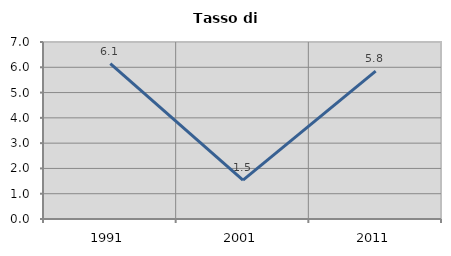
| Category | Tasso di disoccupazione   |
|---|---|
| 1991.0 | 6.145 |
| 2001.0 | 1.541 |
| 2011.0 | 5.845 |